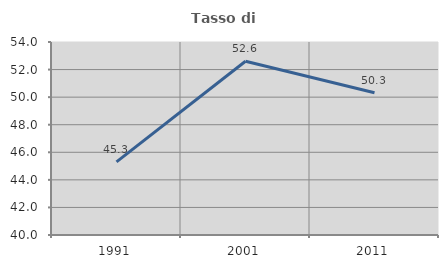
| Category | Tasso di occupazione   |
|---|---|
| 1991.0 | 45.3 |
| 2001.0 | 52.603 |
| 2011.0 | 50.321 |